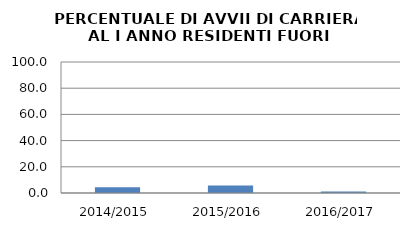
| Category | 2014/2015 2015/2016 2016/2017 |
|---|---|
| 2014/2015 | 4.478 |
| 2015/2016 | 5.814 |
| 2016/2017 | 1.235 |